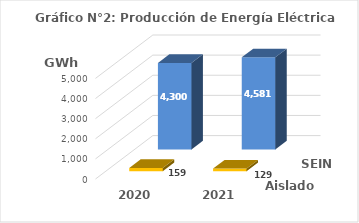
| Category | Aislados | SEIN |
|---|---|---|
| 2020.0 | 159.102 | 4299.747 |
| 2021.0 | 129.386 | 4580.757 |